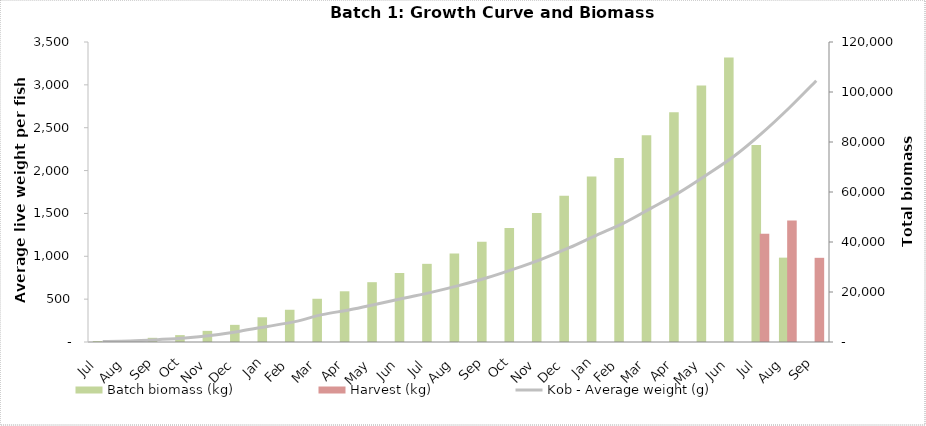
| Category | Batch biomass (kg) | Harvest (kg) |
|---|---|---|
| Apr | 353.244 | 0 |
| May | 770.985 | 0 |
| Jun | 1672.098 | 0 |
| Jul | 2752.717 | 0 |
| Aug | 4453.542 | 0 |
| Sep | 6857.324 | 0 |
| Oct | 9889.69 | 0 |
| Nov | 12891.816 | 0 |
| Dec | 17293.154 | 0 |
| Jan | 20284.821 | 0 |
| Feb | 23922.526 | 0 |
| Mar | 27612.412 | 0 |
| Apr | 31264.587 | 0 |
| May | 35399.82 | 0 |
| Jun | 40071.483 | 0 |
| Jul | 45551.465 | 0 |
| Aug | 51563.873 | 0 |
| Sep | 58499.028 | 0 |